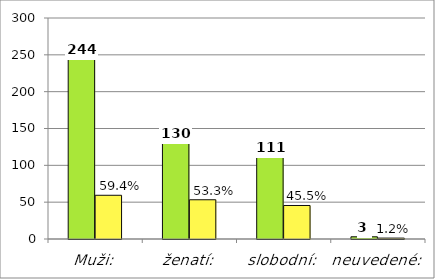
| Category | Series 0 | Series 1 |
|---|---|---|
| Muži: | 244 | 59.367 |
| ženatí: | 130 | 53.279 |
| slobodní: | 111 | 45.492 |
| neuvedené: | 3 | 1.23 |